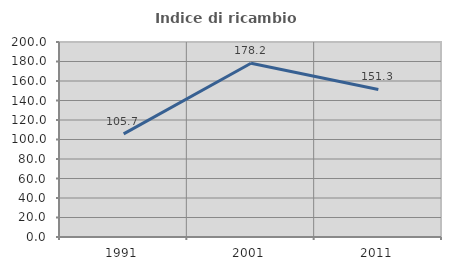
| Category | Indice di ricambio occupazionale  |
|---|---|
| 1991.0 | 105.731 |
| 2001.0 | 178.222 |
| 2011.0 | 151.33 |